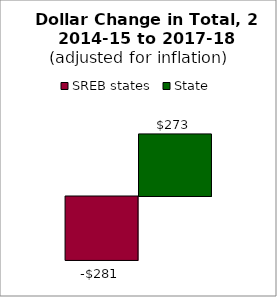
| Category | SREB states | State |
|---|---|---|
| 0 | -280.981 | 272.882 |